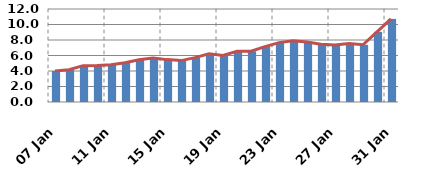
| Category | Series 0 |
|---|---|
| 2016-01-07 | 4 |
| 2016-01-08 | 4.166 |
| 2016-01-09 | 4.692 |
| 2016-01-10 | 4.705 |
| 2016-01-11 | 4.797 |
| 2016-01-12 | 5.063 |
| 2016-01-13 | 5.461 |
| 2016-01-14 | 5.683 |
| 2016-01-15 | 5.469 |
| 2016-01-16 | 5.341 |
| 2016-01-17 | 5.723 |
| 2016-01-18 | 6.229 |
| 2016-01-19 | 6.001 |
| 2016-01-20 | 6.54 |
| 2016-01-21 | 6.543 |
| 2016-01-22 | 7.149 |
| 2016-01-23 | 7.661 |
| 2016-01-24 | 7.89 |
| 2016-01-25 | 7.739 |
| 2016-01-26 | 7.459 |
| 2016-01-27 | 7.363 |
| 2016-01-28 | 7.555 |
| 2016-01-29 | 7.379 |
| 2016-01-30 | 9.057 |
| 2016-01-31 | 10.72 |